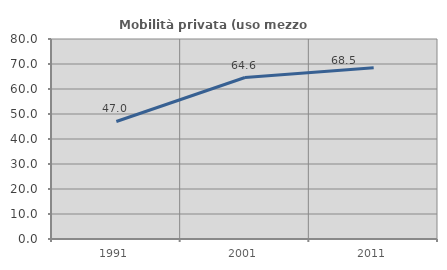
| Category | Mobilità privata (uso mezzo privato) |
|---|---|
| 1991.0 | 47.015 |
| 2001.0 | 64.595 |
| 2011.0 | 68.504 |